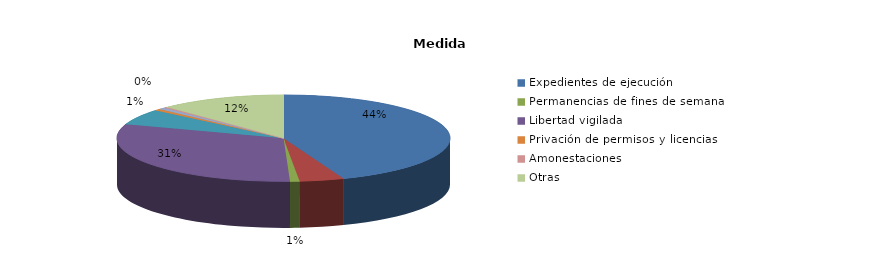
| Category | Series 0 |
|---|---|
| Expedientes de ejecución | 143 |
| Internamientos | 14 |
| Permanencias de fines de semana | 3 |
| Libertad vigilada | 100 |
| Prestaciones en beneficio de la comunidad | 19 |
| Privación de permisos y licencias | 2 |
| Convivencia Familiar Educativa | 2 |
| Amonestaciones | 1 |
| Otras | 40 |